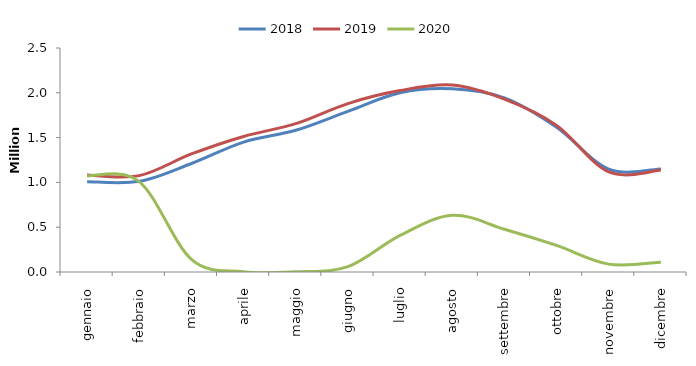
| Category | 2018 | 2019 | 2020 |
|---|---|---|---|
| gennaio | 1007593 | 1082129 | 1072983 |
| febbraio | 1012246 | 1075925 | 1009361 |
| marzo | 1211152 | 1317412 | 141213 |
| aprile | 1450082 | 1512965 | 3208 |
| maggio | 1581486 | 1655248 | 3334 |
| giugno | 1793645 | 1879959 | 59819 |
| luglio | 2000402 | 2025048 | 408674 |
| agosto | 2044438 | 2085955 | 633799 |
| settembre | 1942363 | 1928751 | 477748 |
| ottobre | 1614043 | 1636515 | 296479 |
| novembre | 1148496 | 1116802 | 88004 |
| dicembre | 1150424 | 1137629 | 109535 |